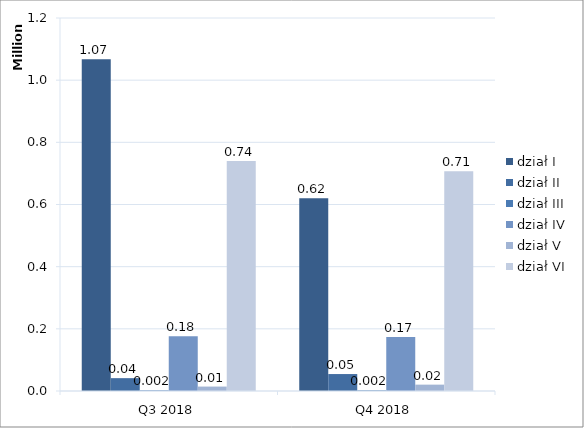
| Category | dział I | dział II | dział III | dział IV | dział V | dział VI |
|---|---|---|---|---|---|---|
| Q3 2018 | 1067691 | 41334 | 2109 | 175815 | 14240 | 739845 |
| Q4 2018 | 619975 | 54533 | 2155 | 173697 | 20460 | 706760 |